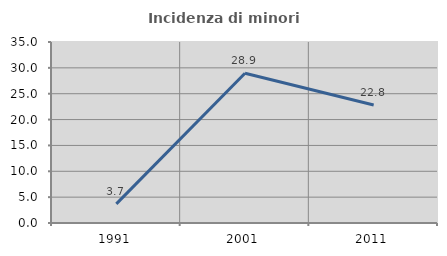
| Category | Incidenza di minori stranieri |
|---|---|
| 1991.0 | 3.704 |
| 2001.0 | 28.947 |
| 2011.0 | 22.824 |